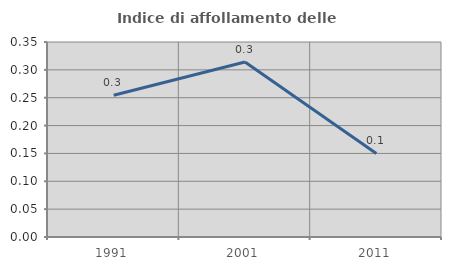
| Category | Indice di affollamento delle abitazioni  |
|---|---|
| 1991.0 | 0.254 |
| 2001.0 | 0.314 |
| 2011.0 | 0.15 |